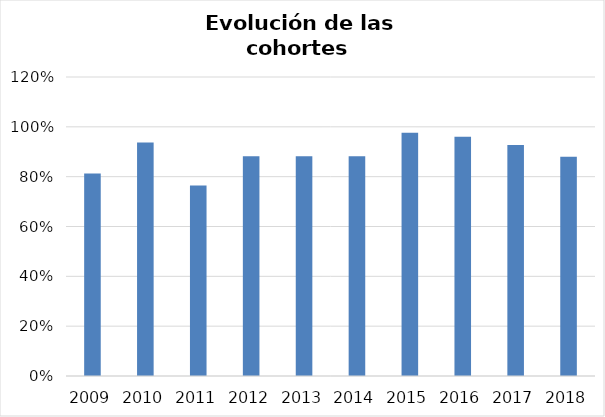
| Category | Series 0 |
|---|---|
| 2009.0 | 0.812 |
| 2010.0 | 0.938 |
| 2011.0 | 0.765 |
| 2012.0 | 0.882 |
| 2013.0 | 0.882 |
| 2014.0 | 0.882 |
| 2015.0 | 0.976 |
| 2016.0 | 0.96 |
| 2017.0 | 0.927 |
| 2018.0 | 0.88 |